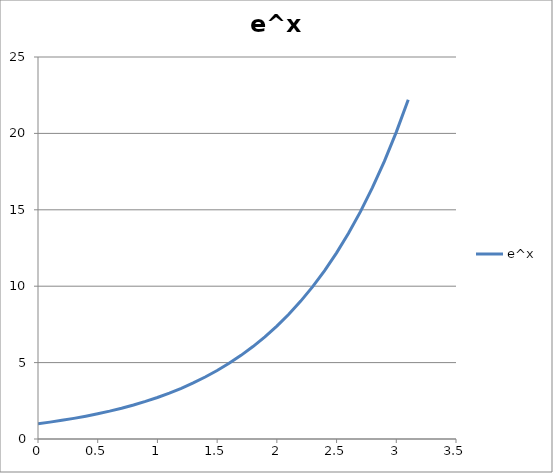
| Category | e^x |
|---|---|
| 0.0 | 1 |
| 0.1 | 1.105 |
| 0.2 | 1.221 |
| 0.3 | 1.35 |
| 0.4 | 1.492 |
| 0.5 | 1.649 |
| 0.6 | 1.822 |
| 0.7 | 2.014 |
| 0.8 | 2.226 |
| 0.9 | 2.46 |
| 1.0 | 2.718 |
| 1.1 | 3.004 |
| 1.2 | 3.32 |
| 1.3 | 3.669 |
| 1.4 | 4.055 |
| 1.5 | 4.482 |
| 1.6 | 4.953 |
| 1.7 | 5.474 |
| 1.8 | 6.05 |
| 1.9 | 6.686 |
| 2.0 | 7.389 |
| 2.1 | 8.166 |
| 2.2 | 9.025 |
| 2.3 | 9.974 |
| 2.4 | 11.023 |
| 2.5 | 12.182 |
| 2.6 | 13.464 |
| 2.7 | 14.88 |
| 2.8 | 16.445 |
| 2.9 | 18.174 |
| 3.0 | 20.086 |
| 3.1 | 22.198 |